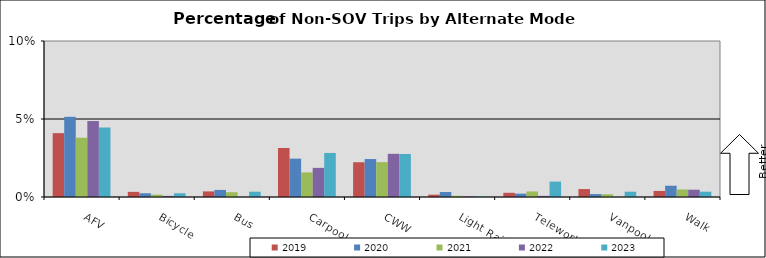
| Category | 2019 | 2020 | 2021 | 2022 | 2023 |
|---|---|---|---|---|---|
| AFV | 0.041 | 0.051 | 0.038 | 0.049 | 0.045 |
| Bicycle | 0.003 | 0.002 | 0.002 | 0.001 | 0.002 |
| Bus | 0.004 | 0.005 | 0.003 | 0 | 0.003 |
| Carpool | 0.031 | 0.025 | 0.016 | 0.019 | 0.028 |
| CWW | 0.022 | 0.024 | 0.022 | 0.028 | 0.028 |
| Light Rail | 0.001 | 0.003 | 0.001 | 0 | 0 |
| Telework | 0.003 | 0.002 | 0.004 | 0.001 | 0.01 |
| Vanpool | 0.005 | 0.002 | 0.002 | 0 | 0.003 |
| Walk | 0.004 | 0.007 | 0.005 | 0.005 | 0.003 |